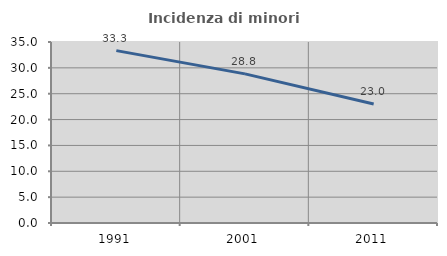
| Category | Incidenza di minori stranieri |
|---|---|
| 1991.0 | 33.333 |
| 2001.0 | 28.834 |
| 2011.0 | 23.007 |